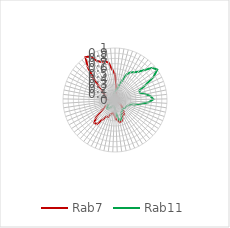
| Category | Rab7 | Rab11 |
|---|---|---|
| 0.0 | 0.492 | 0.147 |
| 0.10913 | 0.293 | 0.175 |
| 0.21825 | 0.138 | 0.209 |
| 0.32738 | 0.067 | 0.275 |
| 0.43651 | 0.073 | 0.391 |
| 0.54563 | 0.055 | 0.547 |
| 0.65476 | 0.077 | 0.613 |
| 0.76389 | 0.04 | 0.647 |
| 0.87302 | 0 | 0.704 |
| 0.98214 | 0.007 | 0.805 |
| 1.09127 | 0.049 | 0.948 |
| 1.2004 | 0.051 | 1 |
| 1.30952 | 0.042 | 0.864 |
| 1.41865 | 0.078 | 0.642 |
| 1.52778 | 0.062 | 0.502 |
| 1.6369 | 0.077 | 0.499 |
| 1.74603 | 0.083 | 0.598 |
| 1.85516 | 0.069 | 0.686 |
| 1.96429 | 0.035 | 0.74 |
| 2.07341 | 0.052 | 0.654 |
| 2.18254 | 0.005 | 0.506 |
| 2.29167 | 0.031 | 0.376 |
| 2.40079 | 0.081 | 0.284 |
| 2.50992 | 0.066 | 0.268 |
| 2.61905 | 0.039 | 0.254 |
| 2.72817 | 0.09 | 0.254 |
| 2.8373 | 0.137 | 0.246 |
| 2.94643 | 0.176 | 0.249 |
| 3.05556 | 0.2 | 0.223 |
| 3.16468 | 0.275 | 0.238 |
| 3.27381 | 0.33 | 0.235 |
| 3.38294 | 0.304 | 0.268 |
| 3.49206 | 0.378 | 0.327 |
| 3.60119 | 0.428 | 0.39 |
| 3.71032 | 0.437 | 0.399 |
| 3.81944 | 0.386 | 0.312 |
| 3.92857 | 0.368 | 0.219 |
| 4.0377 | 0.284 | 0.151 |
| 4.14683 | 0.248 | 0.143 |
| 4.25595 | 0.265 | 0.115 |
| 4.36508 | 0.285 | 0.123 |
| 4.47421 | 0.354 | 0.126 |
| 4.58333 | 0.356 | 0.138 |
| 4.69246 | 0.445 | 0.17 |
| 4.80159 | 0.577 | 0.203 |
| 4.91071 | 0.595 | 0.225 |
| 5.01984 | 0.507 | 0.227 |
| 5.12897 | 0.312 | 0.18 |
| 5.2381 | 0.217 | 0.126 |
| 5.34722 | 0.116 | 0.09 |
| 5.45635 | 0.038 | 0.079 |
| 5.56548 | 0.057 | 0.06 |
| 5.6746 | 0.074 | 0.057 |
| 5.78373 | 0.051 | 0.054 |
| 5.89286 | 0.102 | 0.062 |
| 6.00198 | 0.135 | 0.074 |
| 6.11111 | 0.154 | 0.058 |
| 6.22024 | 0.184 | 0.04 |
| 6.32937 | 0.185 | 0.029 |
| 6.43849 | 0.193 | 0.015 |
| 6.54762 | 0.203 | 0.009 |
| 6.65675 | 0.267 | 0.005 |
| 6.76587 | 0.299 | 0 |
| 6.875 | 0.427 | 0.002 |
| 6.98413 | 0.594 | 0.024 |
| 7.09325 | 0.831 | 0.024 |
| 7.20238 | 1 | 0.03 |
| 7.31151 | 0.963 | 0.034 |
| 7.42063 | 0.828 | 0.038 |
| 7.52976 | 0.776 | 0.056 |
| 7.63889 | 0.772 | 0.08 |
| 7.74802 | 0.73 | 0.122 |
| 7.85714 | 0.582 | 0.143 |